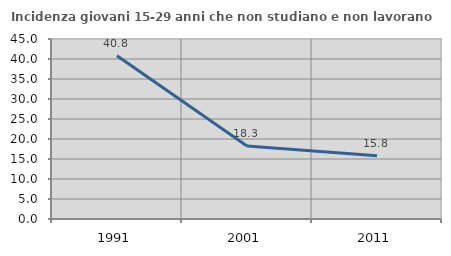
| Category | Incidenza giovani 15-29 anni che non studiano e non lavorano  |
|---|---|
| 1991.0 | 40.789 |
| 2001.0 | 18.254 |
| 2011.0 | 15.842 |